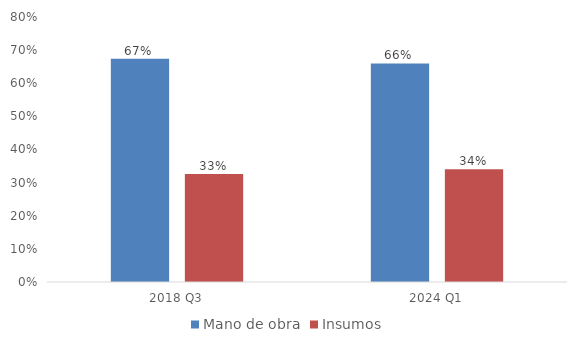
| Category | Mano de obra | Insumos |
|---|---|---|
| 2018 Q3 | 0.674 | 0.326 |
| 2024 Q1 | 0.66 | 0.34 |